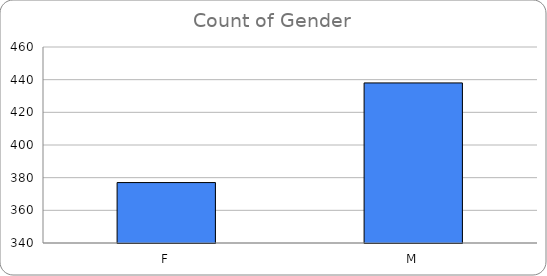
| Category | Total |
|---|---|
| F | 377 |
| M | 438 |